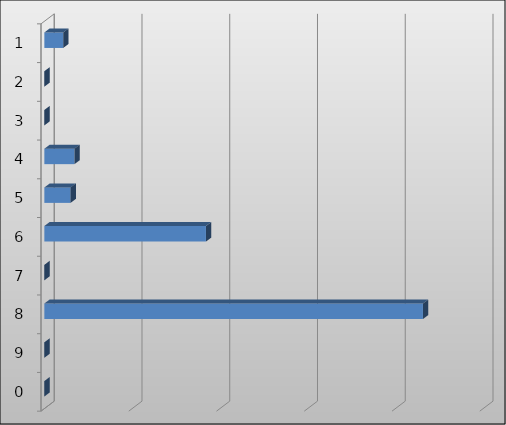
| Category | Series 0 |
|---|---|
| 1.0 | 1078307 |
| 2.0 | 0 |
| 3.0 | 0 |
| 4.0 | 1716162 |
| 5.0 | 1495200 |
| 6.0 | 9207300 |
| 7.0 | 0 |
| 8.0 | 21571988 |
| 9.0 | 0 |
| 0.0 | 0 |